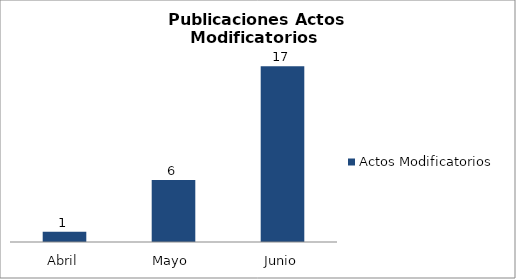
| Category | Actos Modificatorios  |
|---|---|
| Abril | 1 |
| Mayo  | 6 |
| Junio | 17 |